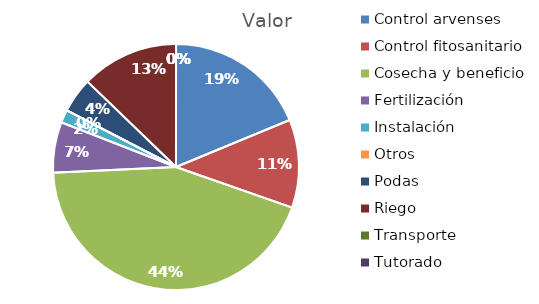
| Category | Valor |
|---|---|
| Control arvenses | 12968500 |
| Control fitosanitario | 8016928 |
| Cosecha y beneficio | 30356643.85 |
| Fertilización | 4597944 |
| Instalación | 1178960 |
| Otros | 0 |
| Podas | 3183192 |
| Riego | 8842200 |
| Transporte | 0 |
| Tutorado | 0 |